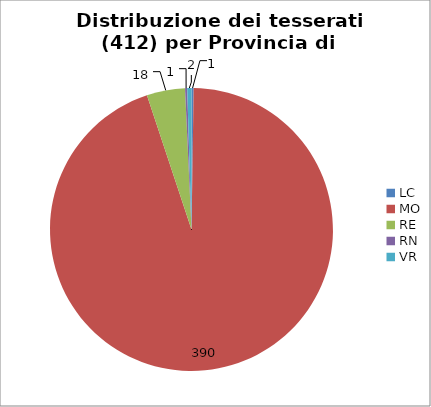
| Category | Nr. Tesserati |
|---|---|
| LC | 1 |
| MO | 390 |
| RE | 18 |
| RN | 1 |
| VR | 2 |